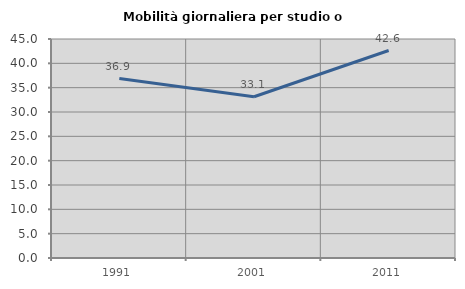
| Category | Mobilità giornaliera per studio o lavoro |
|---|---|
| 1991.0 | 36.877 |
| 2001.0 | 33.142 |
| 2011.0 | 42.63 |